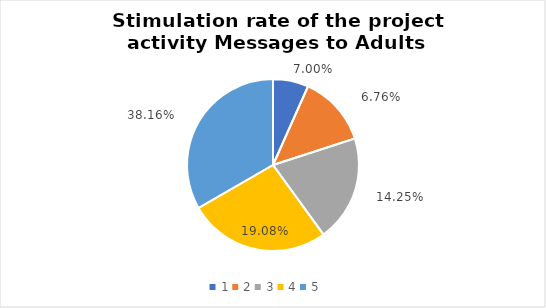
| Category | Series 0 | Series 1 |
|---|---|---|
| 0 | 1 | 0.07 |
| 1 | 2 | 0.068 |
| 2 | 3 | 0.143 |
| 3 | 4 | 0.191 |
| 4 | 5 | 0.382 |